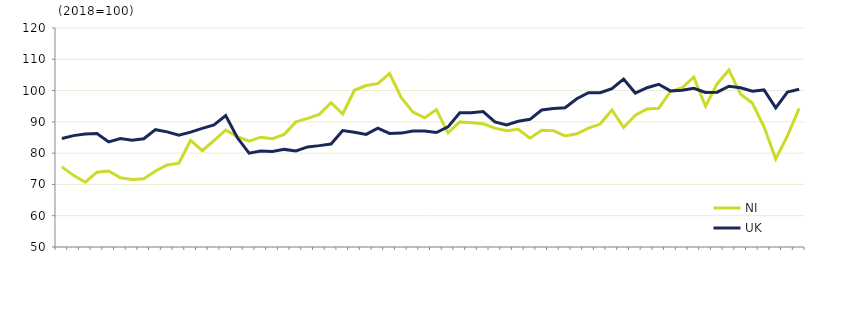
| Category | NI  | UK  |
|---|---|---|
|  | 75.6 | 84.7 |
| Q2 2005 | 72.9 | 85.6 |
|  | 70.7 | 86.1 |
| Q4 2005 | 73.9 | 86.3 |
|  | 74.3 | 83.6 |
| Q2 2006 | 72.1 | 84.7 |
|  | 71.6 | 84.1 |
| Q4 2006 | 71.8 | 84.6 |
|  | 74.3 | 87.5 |
| Q2 2007 | 76.2 | 86.8 |
|  | 76.8 | 85.7 |
| Q4 2007 | 84.1 | 86.7 |
|  | 80.8 | 87.9 |
| Q2 2008 | 84 | 89 |
|  | 87.4 | 92 |
| Q4 2008 | 85.3 | 84.9 |
|  | 83.8 | 80 |
| Q2 2009 | 85.1 | 80.7 |
|  | 84.6 | 80.5 |
| Q4 2009 | 86 | 81.2 |
|  | 90 | 80.7 |
| Q2 2010 | 91.1 | 82 |
|  | 92.4 | 82.4 |
| Q4 2010 | 96.1 | 82.9 |
|  | 92.5 | 87.2 |
| Q2 2011 | 100.1 | 86.7 |
|  | 101.6 | 86 |
| Q4 2011 | 102.2 | 88 |
|  | 105.5 | 86.3 |
| Q2 2012 | 97.7 | 86.4 |
|  | 93.1 | 87.1 |
| Q4 2012 | 91.3 | 87.1 |
|  | 93.9 | 86.6 |
| Q2 2013 | 86.5 | 88.4 |
|  | 90 | 92.9 |
| Q4 2013 | 89.7 | 92.9 |
|  | 89.4 | 93.3 |
| Q2 2014 | 88 | 90 |
|  | 87.2 | 89 |
| Q4 2014 | 87.6 | 90.2 |
|  | 84.8 | 90.8 |
| Q2 2015 | 87.3 | 93.8 |
|  | 87.2 | 94.3 |
| Q4 2015 | 85.5 | 94.5 |
|  | 86.2 | 97.4 |
| Q2 2016 | 88 | 99.3 |
|  | 89.3 | 99.3 |
| Q4 2016 | 93.8 | 100.6 |
|  | 88.2 | 103.7 |
| Q2 2017 | 92.1 | 99.2 |
|  | 94.1 | 100.9 |
| Q4 2017 | 94.3 | 102 |
|  | 99.7 | 99.9 |
| Q2 2018 | 100.9 | 100.1 |
|  | 104.3 | 100.7 |
| Q4 2018 | 95 | 99.4 |
|  | 102.2 | 99.5 |
| Q2 2019 | 106.6 | 101.4 |
|  | 98.8 | 100.9 |
| Q4 2019 | 96 | 99.8 |
|  | 88.4 | 100.2 |
| Q2 2020 | 78.1 | 94.5 |
|  | 85.5 | 99.5 |
| Q4 2020 | 94.3 | 100.4 |